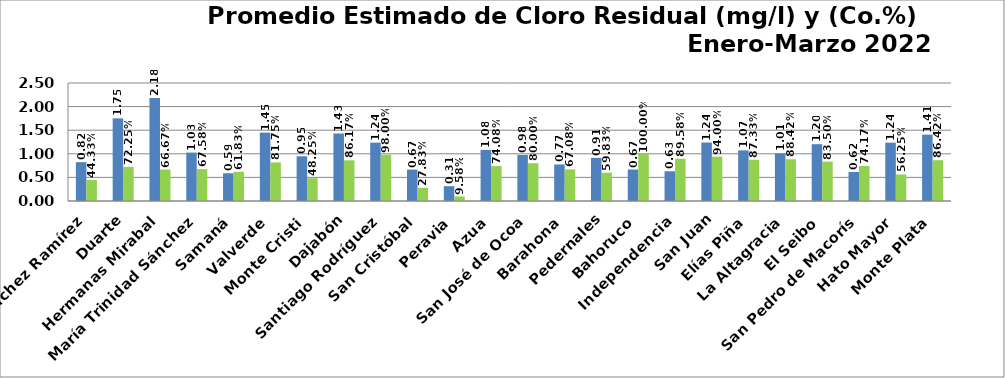
| Category | PROMEDIO TRIMESTRAL (mg/l) | PROMEDIO TRIMESTRAL (Co.%) |
|---|---|---|
| Sánchez Ramírez | 0.822 | 0.443 |
| Duarte | 1.751 | 0.722 |
| Hermanas Mirabal | 2.182 | 0.667 |
| María Trinidad Sánchez | 1.026 | 0.676 |
| Samaná | 0.588 | 0.618 |
| Valverde | 1.448 | 0.818 |
| Monte Cristi | 0.948 | 0.482 |
| Dajabón | 1.43 | 0.862 |
| Santiago Rodríguez | 1.236 | 0.98 |
| San Cristóbal | 0.665 | 0.278 |
| Peravia | 0.314 | 0.096 |
| Azua | 1.082 | 0.741 |
| San José de Ocoa | 0.976 | 0.8 |
| Barahona | 0.774 | 0.671 |
| Pedernales | 0.913 | 0.598 |
| Bahoruco | 0.667 | 1 |
| Independencia | 0.63 | 0.896 |
| San Juan | 1.238 | 0.94 |
| Elías Piña | 1.073 | 0.873 |
| La Altagracia | 1.01 | 0.884 |
| El Seibo | 1.203 | 0.835 |
| San Pedro de Macorís | 0.615 | 0.742 |
| Hato Mayor | 1.236 | 0.562 |
| Monte Plata | 1.406 | 0.864 |